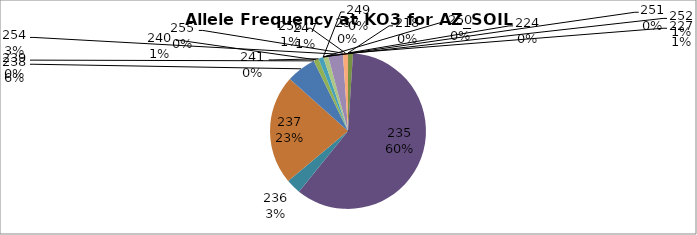
| Category | Series 0 |
|---|---|
| 218.0 | 0 |
| 224.0 | 0 |
| 227.0 | 0.01 |
| 235.0 | 0.598 |
| 236.0 | 0.031 |
| 237.0 | 0.227 |
| 238.0 | 0.062 |
| 239.0 | 0 |
| 240.0 | 0.01 |
| 241.0 | 0 |
| 247.0 | 0.01 |
| 249.0 | 0 |
| 250.0 | 0 |
| 251.0 | 0 |
| 252.0 | 0.01 |
| 254.0 | 0.031 |
| 255.0 | 0 |
| 256.0 | 0.01 |
| 257.0 | 0 |